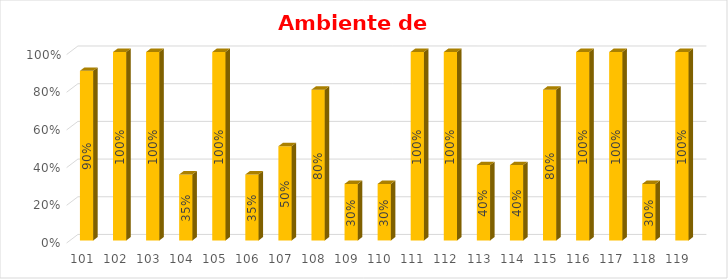
| Category | % Avance |
|---|---|
| 101.0 | 0.9 |
| 102.0 | 1 |
| 103.0 | 1 |
| 104.0 | 0.35 |
| 105.0 | 1 |
| 106.0 | 0.35 |
| 107.0 | 0.5 |
| 108.0 | 0.8 |
| 109.0 | 0.3 |
| 110.0 | 0.3 |
| 111.0 | 1 |
| 112.0 | 1 |
| 113.0 | 0.4 |
| 114.0 | 0.4 |
| 115.0 | 0.8 |
| 116.0 | 1 |
| 117.0 | 1 |
| 118.0 | 0.3 |
| 119.0 | 1 |